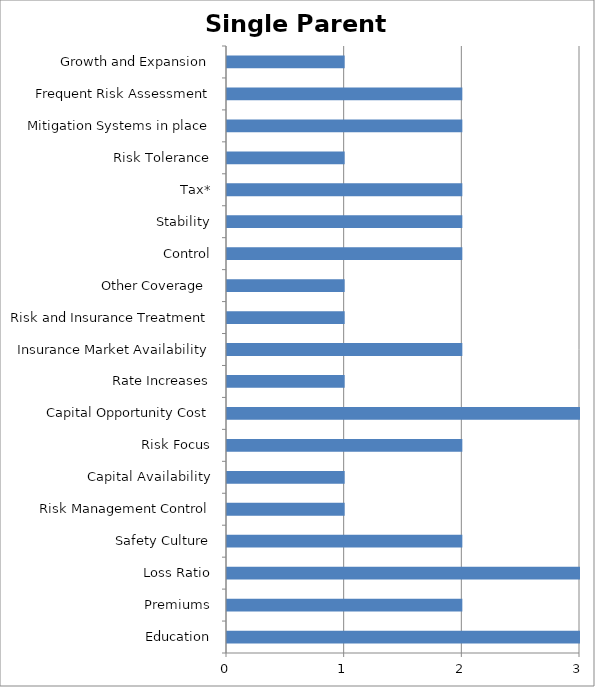
| Category | Series 0 |
|---|---|
| Education | 3 |
| Premiums | 2 |
| Loss Ratio | 3 |
| Safety Culture | 2 |
| Risk Management Control | 1 |
| Capital Availability | 1 |
| Risk Focus | 2 |
| Capital Opportunity Cost | 3 |
| Rate Increases | 1 |
| Insurance Market Availability | 2 |
| Risk and Insurance Treatment | 1 |
| Other Coverage  | 1 |
| Control | 2 |
| Stability | 2 |
| Tax* | 2 |
| Risk Tolerance | 1 |
| Mitigation Systems in place | 2 |
| Frequent Risk Assessment | 2 |
| Growth and Expansion | 1 |